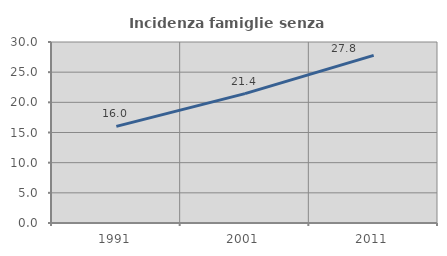
| Category | Incidenza famiglie senza nuclei |
|---|---|
| 1991.0 | 16.016 |
| 2001.0 | 21.442 |
| 2011.0 | 27.778 |